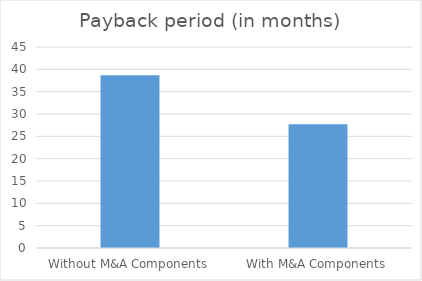
| Category | Payback period (in months) |
|---|---|
| Without M&A Components | 38.703 |
| With M&A Components | 27.703 |